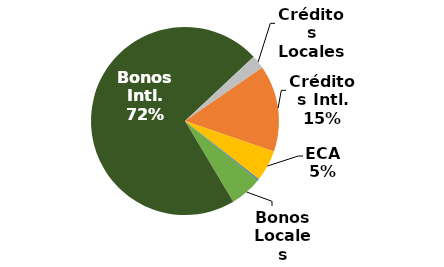
| Category | Series 0 |
|---|---|
| Bonos Locales | 0.056 |
| Bonos Intl. | 0.716 |
| Créditos Locales | 0.023 |
| Créditos Intl. | 0.149 |
| ECA | 0.054 |
| Leasing Local | 0.002 |